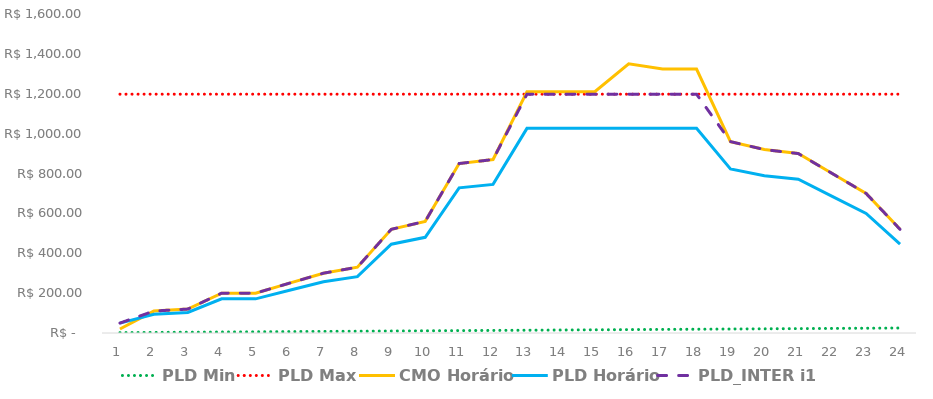
| Category | PLD Min | PLD Max | CMO Horário | PLD Horário | PLD_INTER i1 |
|---|---|---|---|---|---|
| 0 | 2 | 1197.87 | 20 | 49.77 | 49.77 |
| 1 | 3 | 1197.87 | 110 | 94.252 | 110 |
| 2 | 4 | 1197.87 | 120 | 102.817 | 120 |
| 3 | 5 | 1197.87 | 200 | 171.362 | 200 |
| 4 | 6 | 1197.87 | 200 | 171.362 | 200 |
| 5 | 7 | 1197.87 | 250 | 214.2 | 250 |
| 6 | 8 | 1197.87 | 300 | 257.038 | 300 |
| 7 | 9 | 1197.87 | 330 | 282.745 | 330 |
| 8 | 10 | 1197.87 | 520 | 445.531 | 520 |
| 9 | 11 | 1197.87 | 560 | 479.803 | 560 |
| 10 | 12 | 1197.87 | 850 | 728.276 | 850 |
| 11 | 13 | 1197.87 | 870 | 745.407 | 870 |
| 12 | 14 | 1197.87 | 1210 | 1026.333 | 1197.87 |
| 13 | 15 | 1197.87 | 1210 | 1026.333 | 1197.87 |
| 14 | 16 | 1197.87 | 1210 | 1026.333 | 1197.87 |
| 15 | 17 | 1197.87 | 1350 | 1026.333 | 1197.87 |
| 16 | 18 | 1197.87 | 1324.18 | 1026.333 | 1197.87 |
| 17 | 19 | 1197.87 | 1324.18 | 1026.333 | 1197.87 |
| 18 | 20 | 1197.87 | 960 | 822.527 | 960 |
| 19 | 21 | 1197.87 | 920 | 788.255 | 920 |
| 20 | 22 | 1197.87 | 900 | 771.114 | 900 |
| 21 | 23 | 1197.87 | 800 | 685.438 | 800 |
| 22 | 24 | 1197.87 | 700 | 599.752 | 700 |
| 23 | 25 | 1197.87 | 520 | 445.531 | 520 |